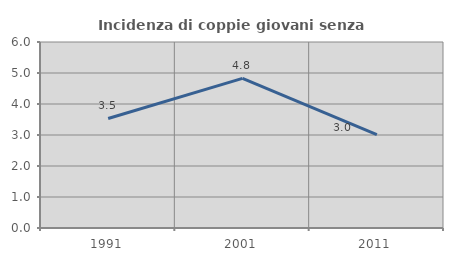
| Category | Incidenza di coppie giovani senza figli |
|---|---|
| 1991.0 | 3.533 |
| 2001.0 | 4.826 |
| 2011.0 | 3.014 |